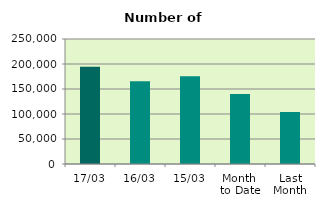
| Category | Series 0 |
|---|---|
| 17/03 | 194384 |
| 16/03 | 165482 |
| 15/03 | 175556 |
| Month 
to Date | 139947.538 |
| Last
Month | 103910.7 |